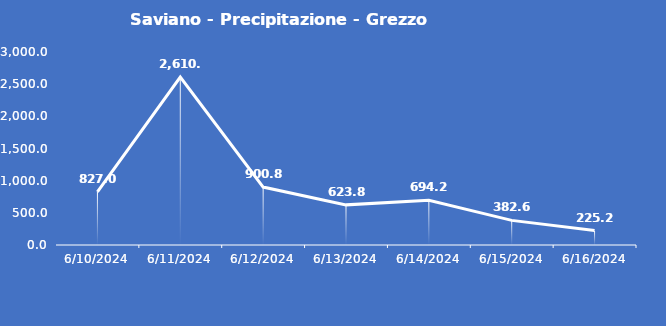
| Category | Saviano - Precipitazione - Grezzo (mm) |
|---|---|
| 6/10/24 | 827 |
| 6/11/24 | 2610.6 |
| 6/12/24 | 900.8 |
| 6/13/24 | 623.8 |
| 6/14/24 | 694.2 |
| 6/15/24 | 382.6 |
| 6/16/24 | 225.2 |